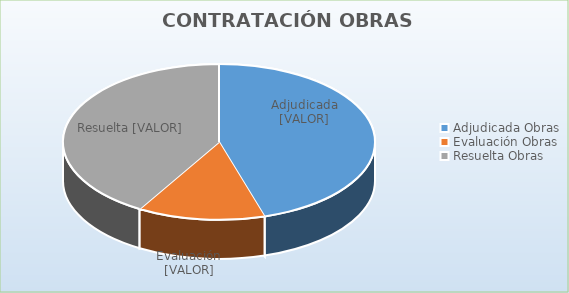
| Category | Total |
|---|---|
| 0 | 3525714.5 |
| 1 | 1027986.76 |
| 2 | 3231597.79 |